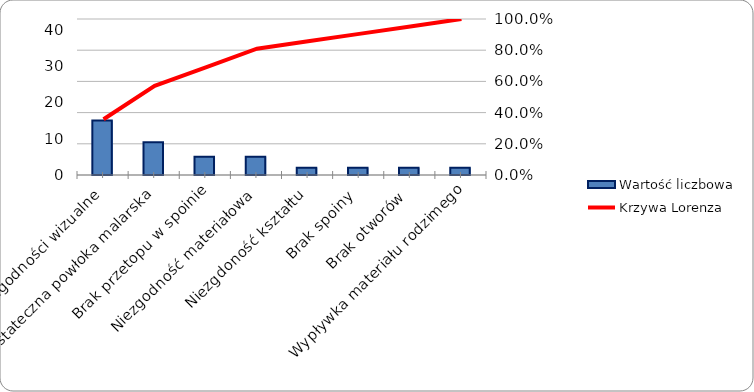
| Category | Wartość liczbowa |
|---|---|
| Niezgodności wizualne | 15 |
| Niedostateczna powłoka malarska | 9 |
| Brak przetopu w spoinie | 5 |
| Niezgodność materiałowa | 5 |
| Niezgdoność kształtu | 2 |
| Brak spoiny | 2 |
| Brak otworów | 2 |
| Wypływka materiału rodzimego | 2 |